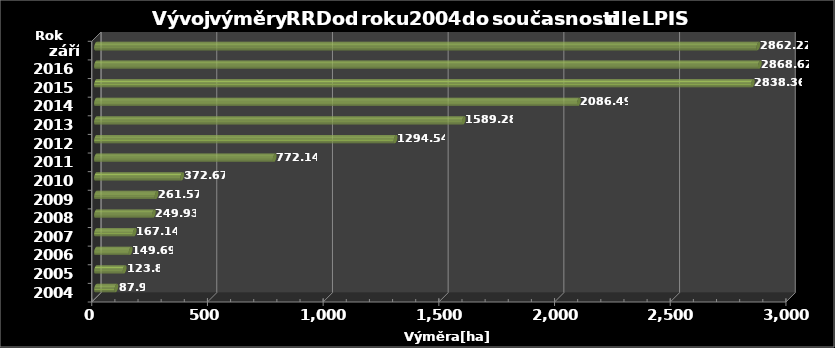
| Category | Výměra [ha] |
|---|---|
| 2004 | 87.9 |
| 2005 | 123.8 |
| 2006 | 149.69 |
| 2007 | 167.14 |
| 2008 | 249.93 |
| 2009 | 261.57 |
| 2010 | 372.67 |
| 2011 | 772.14 |
| 2012 | 1294.54 |
| 2013 | 1589.28 |
| 2014 | 2086.49 |
| 2015 | 2838.36 |
| 2016 | 2868.62 |
| září 2017 | 2862.22 |